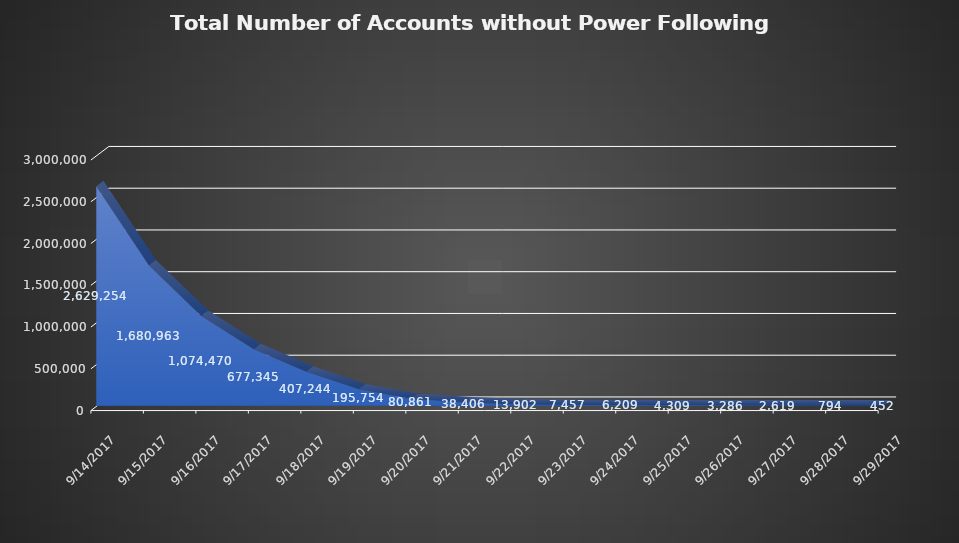
| Category | Series 0 |
|---|---|
| 9/14/17 | 2629254 |
| 9/15/17 | 1680963 |
| 9/16/17 | 1074470 |
| 9/17/17 | 677345 |
| 9/18/17 | 407244 |
| 9/19/17 | 195754 |
| 9/20/17 | 80861 |
| 9/21/17 | 38406 |
| 9/22/17 | 13902 |
| 9/23/17 | 7457 |
| 9/24/17 | 6209 |
| 9/25/17 | 4309 |
| 9/26/17 | 3286 |
| 9/27/17 | 2619 |
| 9/28/17 | 794 |
| 9/29/17 | 452 |